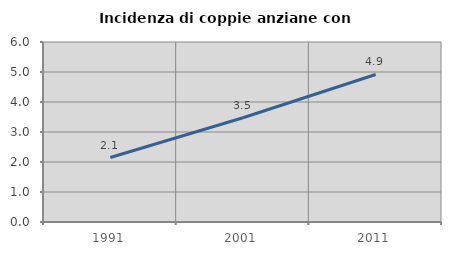
| Category | Incidenza di coppie anziane con figli |
|---|---|
| 1991.0 | 2.149 |
| 2001.0 | 3.475 |
| 2011.0 | 4.917 |